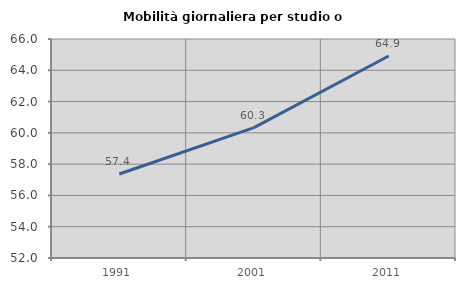
| Category | Mobilità giornaliera per studio o lavoro |
|---|---|
| 1991.0 | 57.368 |
| 2001.0 | 60.336 |
| 2011.0 | 64.912 |